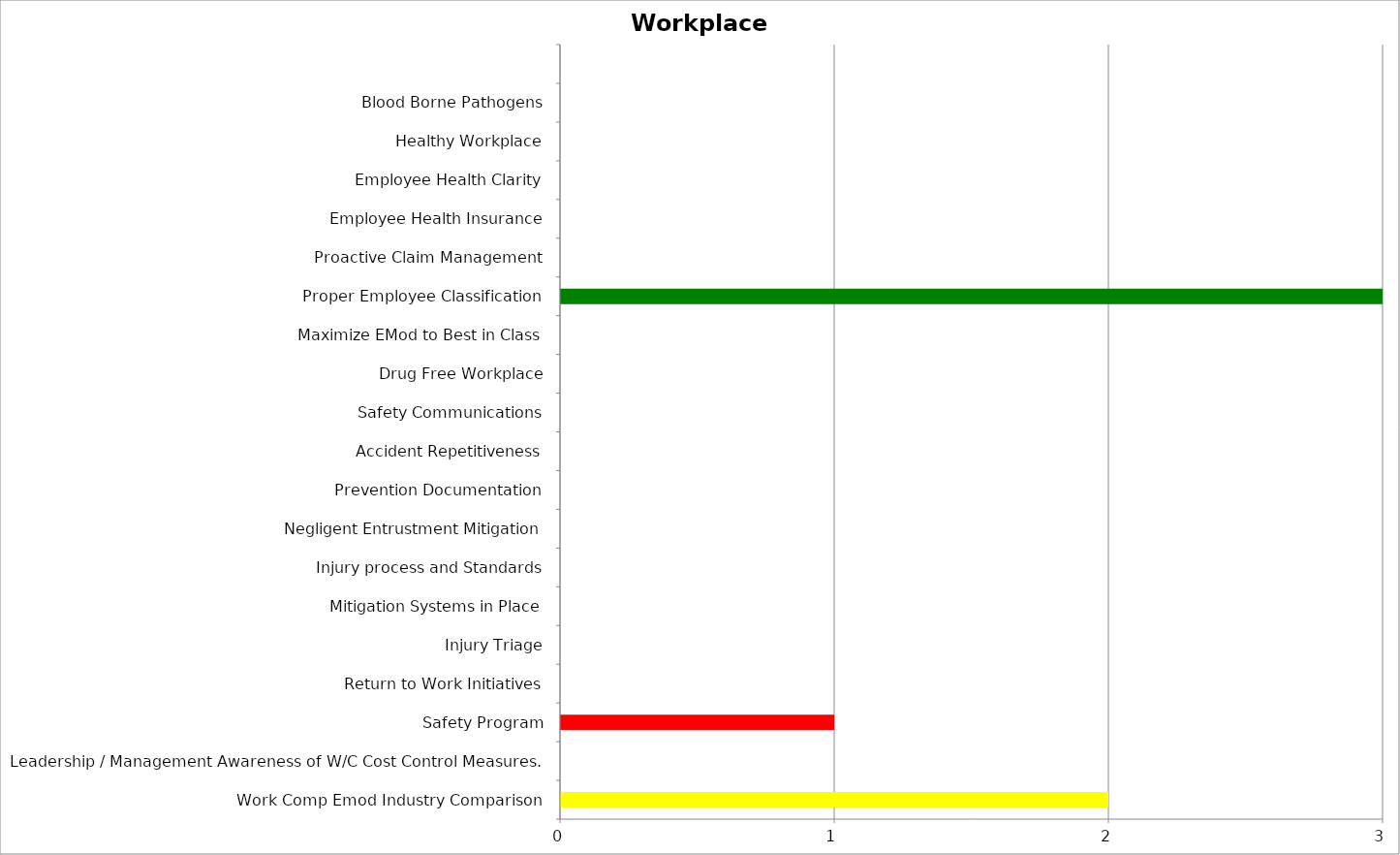
| Category | Low | Medium | High |
|---|---|---|---|
| Work Comp Emod Industry Comparison | 0 | 2 | 0 |
| Leadership / Management Awareness of W/C Cost Control Measures. | 0 | 0 | 0 |
| Safety Program | 0 | 0 | 1 |
| Return to Work Initiatives | 0 | 0 | 0 |
| Injury Triage | 0 | 0 | 0 |
| Mitigation Systems in Place | 0 | 0 | 0 |
| Injury process and Standards | 0 | 0 | 0 |
| Negligent Entrustment Mitigation | 0 | 0 | 0 |
| Prevention Documentation | 0 | 0 | 0 |
| Accident Repetitiveness | 0 | 0 | 0 |
| Safety Communications | 0 | 0 | 0 |
| Drug Free Workplace | 0 | 0 | 0 |
| Maximize EMod to Best in Class | 0 | 0 | 0 |
| Proper Employee Classification | 3 | 0 | 0 |
| Proactive Claim Management | 0 | 0 | 0 |
| Employee Health Insurance | 0 | 0 | 0 |
| Employee Health Clarity | 0 | 0 | 0 |
| Healthy Workplace | 0 | 0 | 0 |
| Blood Borne Pathogens | 0 | 0 | 0 |